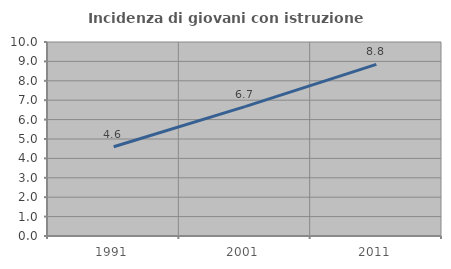
| Category | Incidenza di giovani con istruzione universitaria |
|---|---|
| 1991.0 | 4.6 |
| 2001.0 | 6.667 |
| 2011.0 | 8.85 |